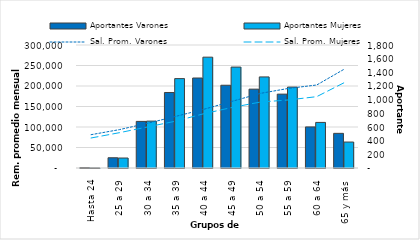
| Category | Aportantes Varones | Aportantes Mujeres |
|---|---|---|
| 0 | 7 | 1 |
| 1 | 150 | 146 |
| 2 | 682 | 686 |
| 3 | 1105 | 1308 |
| 4 | 1317 | 1622 |
| 5 | 1211 | 1477 |
| 6 | 1154 | 1333 |
| 7 | 1081 | 1184 |
| 8 | 601 | 667 |
| 9 | 507 | 380 |